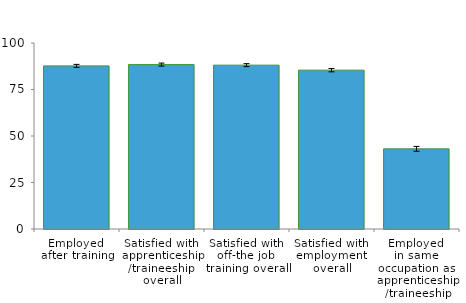
| Category | Series 0 |
|---|---|
| Employed 
after training | 87.7 |
| Satisfied with 
apprenticeship
/traineeship 
overall | 88.4 |
| Satisfied with 
off-the job 
training overall | 88.1 |
| Satisfied with 
employment 
overall | 85.4 |
| Employed 
in same 
occupation as 
apprenticeship
/traineeship | 43.1 |